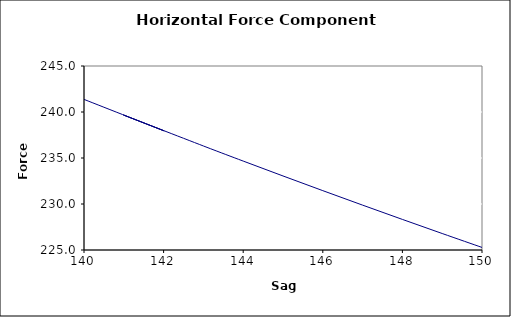
| Category | To  |
|---|---|
| 150.0 | 225.28 |
| 149.0 | 226.792 |
| 148.0 | 228.324 |
| 147.0 | 229.878 |
| 146.0 | 231.452 |
| 145.0 | 233.048 |
| 144.0 | 234.667 |
| 143.0 | 236.308 |
| 141.0 | 239.66 |
| 142.0 | 237.972 |
| 140.0 | 241.371 |
| 139.0 | 243.108 |
| 138.0 | 244.87 |
| 137.0 | 246.657 |
| 136.0 | 248.471 |
| 135.0 | 250.311 |